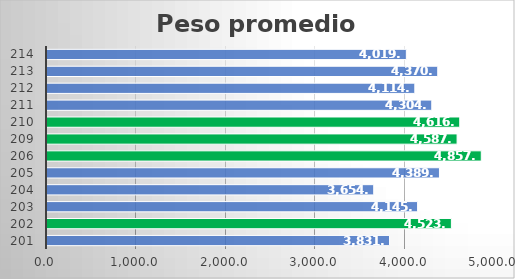
| Category | 15-05-22 |
|---|---|
| 201 | 3831.457 |
| 202 | 4523.507 |
| 203 | 4145.281 |
| 204 | 3654.745 |
| 205 | 4389.903 |
| 206 | 4857.899 |
| 209 | 4587.042 |
| 210 | 4616.787 |
| 211 | 4303.98 |
| 212 | 4114.372 |
| 213 | 4370.67 |
| 214 | 4019.835 |